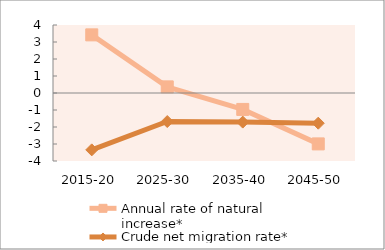
| Category | Annual rate of natural increase* | Crude net migration rate* |
|---|---|---|
| 2015-20 | 3.42 | -3.345 |
| 2025-30 | 0.36 | -1.678 |
| 2035-40 | -0.966 | -1.712 |
| 2045-50 | -2.994 | -1.776 |